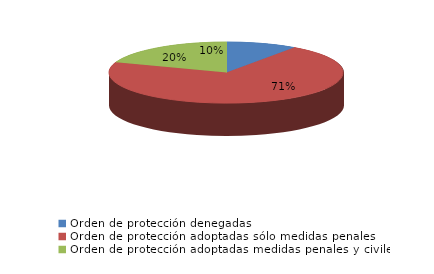
| Category | Series 0 |
|---|---|
| Orden de protección denegadas | 4 |
| Orden de protección adoptadas sólo medidas penales | 29 |
| Orden de protección adoptadas medidas penales y civiles | 8 |